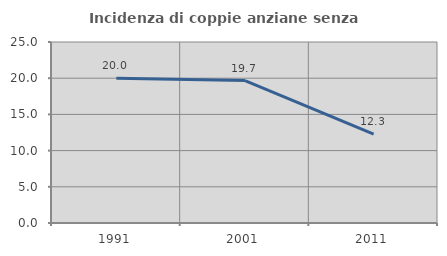
| Category | Incidenza di coppie anziane senza figli  |
|---|---|
| 1991.0 | 20 |
| 2001.0 | 19.672 |
| 2011.0 | 12.281 |